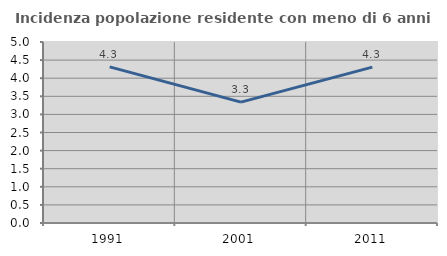
| Category | Incidenza popolazione residente con meno di 6 anni |
|---|---|
| 1991.0 | 4.313 |
| 2001.0 | 3.339 |
| 2011.0 | 4.307 |